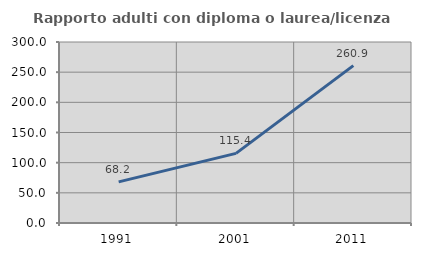
| Category | Rapporto adulti con diploma o laurea/licenza media  |
|---|---|
| 1991.0 | 68.182 |
| 2001.0 | 115.385 |
| 2011.0 | 260.87 |